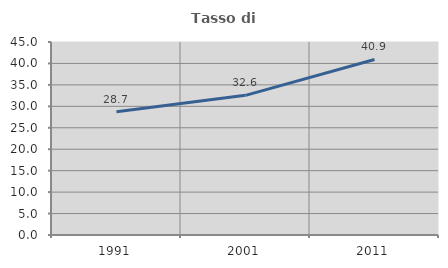
| Category | Tasso di occupazione   |
|---|---|
| 1991.0 | 28.717 |
| 2001.0 | 32.565 |
| 2011.0 | 40.935 |